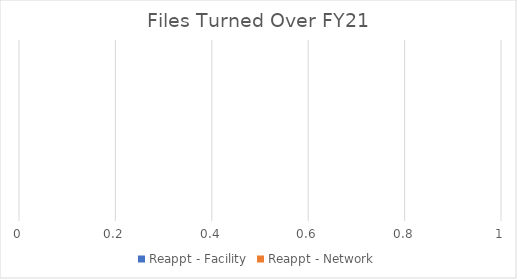
| Category | Reappt - Facility | Reappt - Network |
|---|---|---|
|  | 0 | 0 |
|  | 0 | 0 |
|  | 0 | 0 |